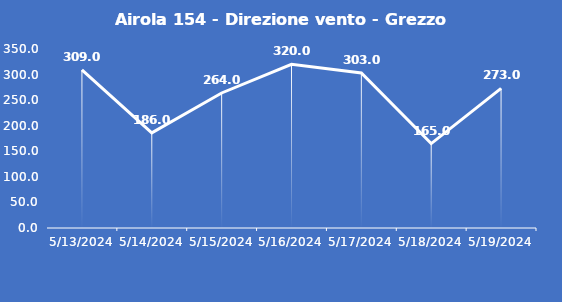
| Category | Airola 154 - Direzione vento - Grezzo (°N) |
|---|---|
| 5/13/24 | 309 |
| 5/14/24 | 186 |
| 5/15/24 | 264 |
| 5/16/24 | 320 |
| 5/17/24 | 303 |
| 5/18/24 | 165 |
| 5/19/24 | 273 |